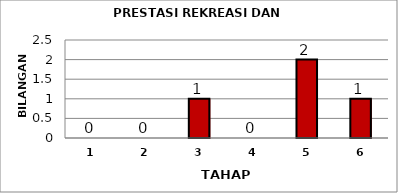
| Category | Series 0 |
|---|---|
| 1.0 | 0 |
| 2.0 | 0 |
| 3.0 | 1 |
| 4.0 | 0 |
| 5.0 | 2 |
| 6.0 | 1 |